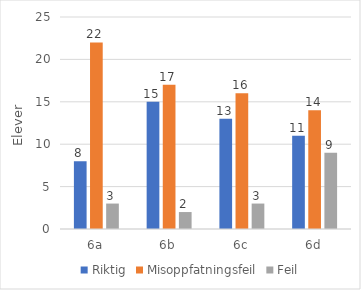
| Category | Riktig | Misoppfatningsfeil | Feil |
|---|---|---|---|
| 6a | 8 | 22 | 3 |
| 6b | 15 | 17 | 2 |
| 6c | 13 | 16 | 3 |
| 6d | 11 | 14 | 9 |